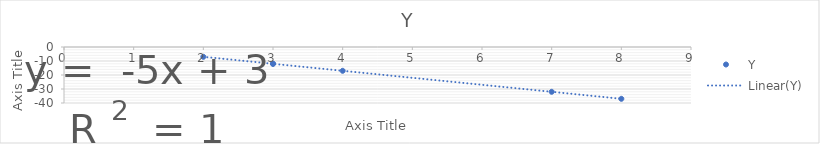
| Category | Y |
|---|---|
| 3.0 | -12 |
| 4.0 | -17 |
| 7.0 | -32 |
| 8.0 | -37 |
| 3.0 | -12 |
| 2.0 | -7 |